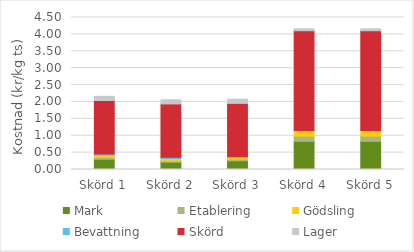
| Category | Mark | Etablering | Gödsling | Bevattning | Skörd | Lager |
|---|---|---|---|---|---|---|
| Skörd 1 | 0.302 | 0.055 | 0.07 | 0.035 | 1.581 | 0.124 |
| Skörd 2 | 0.216 | 0.04 | 0.07 | 0.035 | 1.581 | 0.124 |
| Skörd 3 | 0.259 | 0.048 | 0.07 | 0 | 1.581 | 0.124 |
| Skörd 4 | 0.833 | 0.153 | 0.168 | 0 | 2.954 | 0.056 |
| Skörd 5 | 0.833 | 0.153 | 0.168 | 0 | 2.954 | 0.056 |